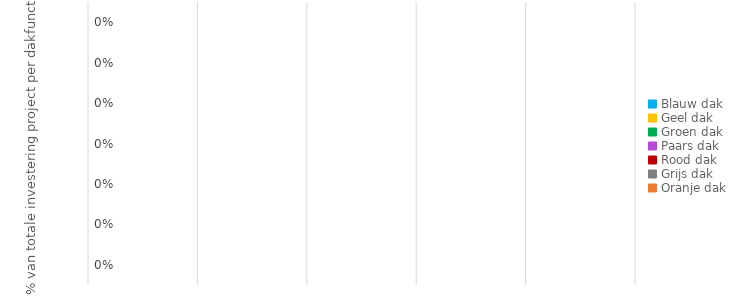
| Category | % van totale investering project |
|---|---|
| Blauw dak | 0 |
| Geel dak | 0 |
| Groen dak | 0 |
| Paars dak | 0 |
| Rood dak | 0 |
| Grijs dak | 0 |
| Oranje dak | 0 |